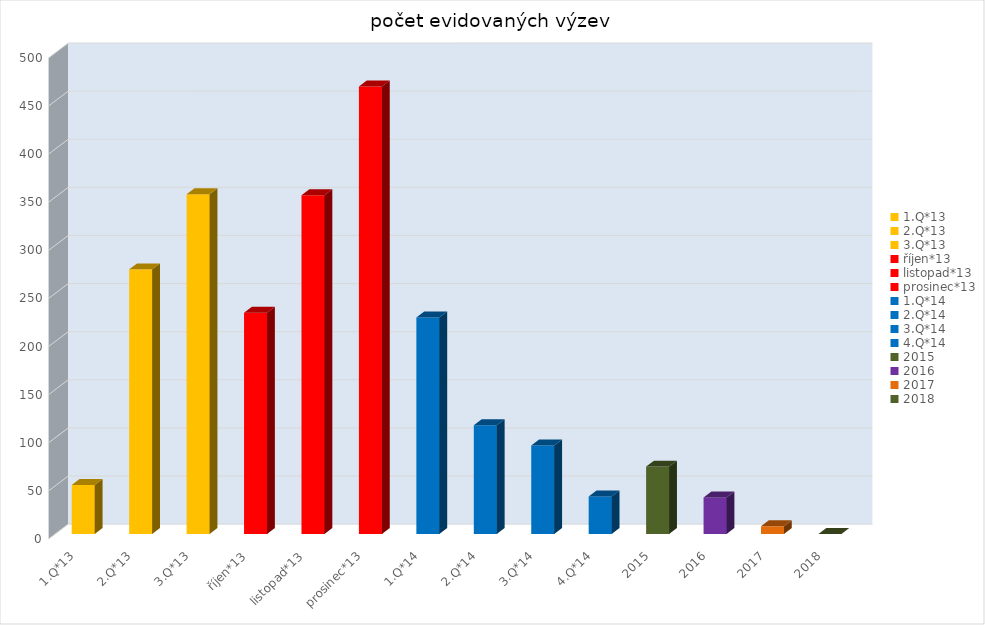
| Category | počet evidovaných výzev |
|---|---|
| 1.Q*13 | 51 |
| 2.Q*13 | 275 |
| 3.Q*13 | 353 |
| říjen*13 | 230 |
| listopad*13 | 352 |
| prosinec*13 | 465 |
| 1.Q*14 | 225 |
| 2.Q*14 | 113 |
| 3.Q*14 | 92 |
| 4.Q*14 | 39 |
| 2015 | 70 |
| 2016 | 38 |
| 2017 | 8 |
| 2018 | 0 |